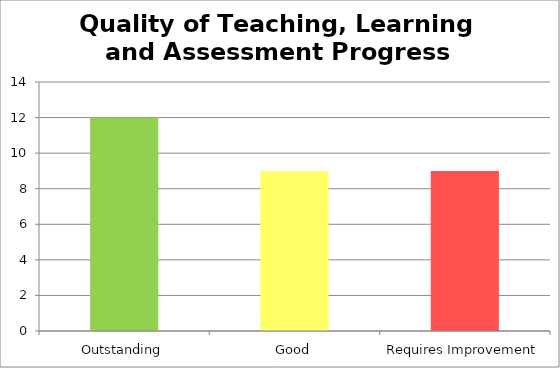
| Category | Series 0 |
|---|---|
| 0 | 12 |
| 1 | 9 |
| 2 | 9 |